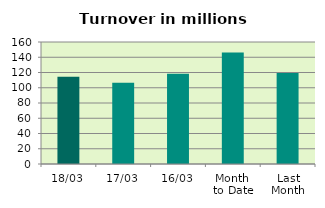
| Category | Series 0 |
|---|---|
| 18/03 | 114.444 |
| 17/03 | 106.641 |
| 16/03 | 118.288 |
| Month 
to Date | 146.346 |
| Last
Month | 119.242 |